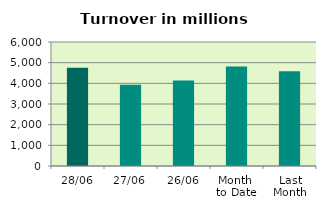
| Category | Series 0 |
|---|---|
| 28/06 | 4757.904 |
| 27/06 | 3933.25 |
| 26/06 | 4139.982 |
| Month 
to Date | 4815.104 |
| Last
Month | 4586.899 |